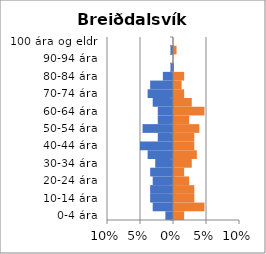
| Category | % karlar | %konur |
|---|---|---|
| 0-4 ára | -0.012 | 0.015 |
| 5-9 ára | -0.031 | 0.046 |
| 10-14 ára | -0.035 | 0.031 |
| 15-19 ára | -0.035 | 0.031 |
| 20-24 ára | -0.031 | 0.023 |
| 25-29 ára | -0.035 | 0.015 |
| 30-34 ára | -0.027 | 0.027 |
| 35-39 ára | -0.038 | 0.035 |
| 40-44 ára | -0.05 | 0.031 |
| 45-49 ára | -0.023 | 0.031 |
| 50-54 ára | -0.046 | 0.038 |
| 55-59 ára | -0.023 | 0.023 |
| 60-64 ára | -0.023 | 0.046 |
| 65-69 ára | -0.031 | 0.027 |
| 70-74 ára | -0.038 | 0.015 |
| 75-79 ára | -0.035 | 0.012 |
| 80-84 ára | -0.015 | 0.015 |
| 85-89 ára | -0.004 | 0 |
| 90-94 ára | 0 | 0 |
| 95-99 ára | -0.004 | 0.004 |
| 100 ára og eldri | 0 | 0 |